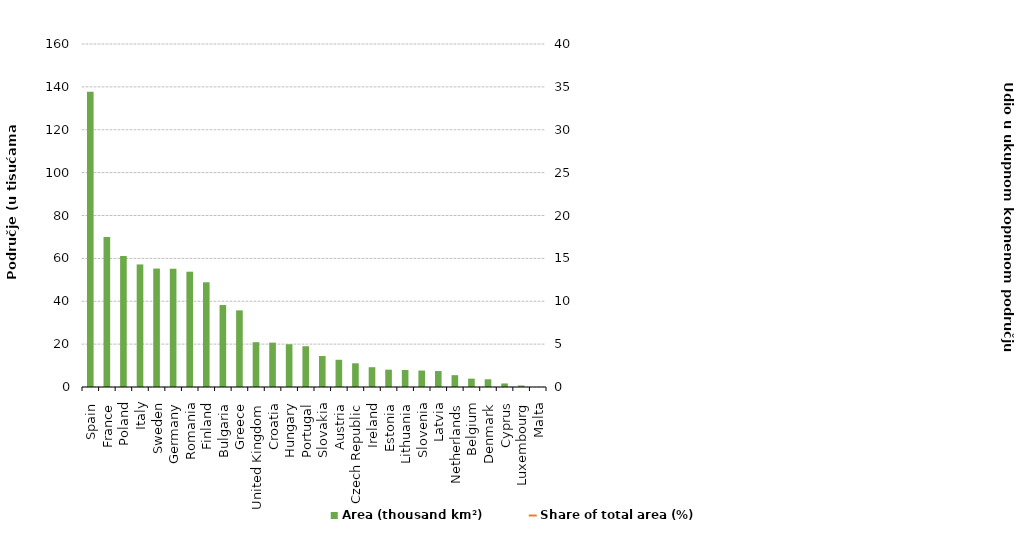
| Category | Area (thousand km²) |
|---|---|
| _x0005_Spain | 137.757 |
| _x0006_France | 69.974 |
| _x0006_Poland | 61.165 |
| _x0005_Italy | 57.172 |
| _x0006_Sweden | 55.25 |
| _x0007_Germany | 55.17 |
| _x0007_Romania | 53.781 |
| _x0007_Finland | 48.847 |
| _x0008_Bulgaria | 38.222 |
| _x0006_Greece | 35.747 |
| _x000e_United Kingdom | 20.901 |
| _x0007_Croatia | 20.704 |
| _x0007_Hungary | 19.949 |
| _x0008_Portugal | 19.01 |
| _x0008_Slovakia | 14.442 |
| _x0007_Austria | 12.691 |
| _x000e_Czech Republic | 11.061 |
| _x0007_Ireland | 9.227 |
| _x0007_Estonia | 8.083 |
| 	Lithuania | 7.938 |
| _x0008_Slovenia | 7.674 |
| _x0006_Latvia | 7.446 |
| _x000b_Netherlands | 5.518 |
| _x0007_Belgium | 3.887 |
| _x0007_Denmark | 3.594 |
| _x0006_Cyprus | 1.653 |
| 
Luxembourg | 0.702 |
| _x0005_Malta | 0.041 |